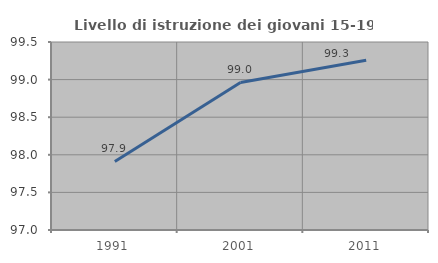
| Category | Livello di istruzione dei giovani 15-19 anni |
|---|---|
| 1991.0 | 97.911 |
| 2001.0 | 98.962 |
| 2011.0 | 99.257 |